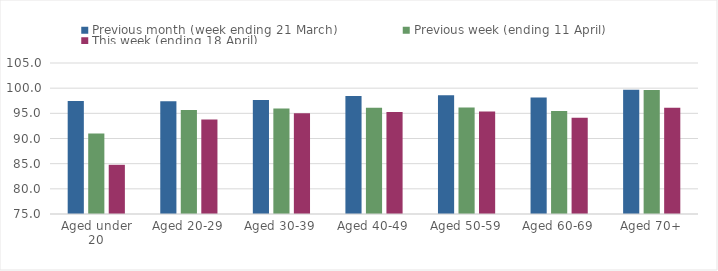
| Category | Previous month (week ending 21 March) | Previous week (ending 11 April) | This week (ending 18 April) |
|---|---|---|---|
| Aged under 20 | 97.449 | 90.985 | 84.773 |
| Aged 20-29 | 97.411 | 95.677 | 93.777 |
| Aged 30-39 | 97.644 | 95.973 | 95.02 |
| Aged 40-49 | 98.439 | 96.096 | 95.263 |
| Aged 50-59 | 98.611 | 96.14 | 95.357 |
| Aged 60-69 | 98.159 | 95.454 | 94.124 |
| Aged 70+ | 99.706 | 99.618 | 96.091 |